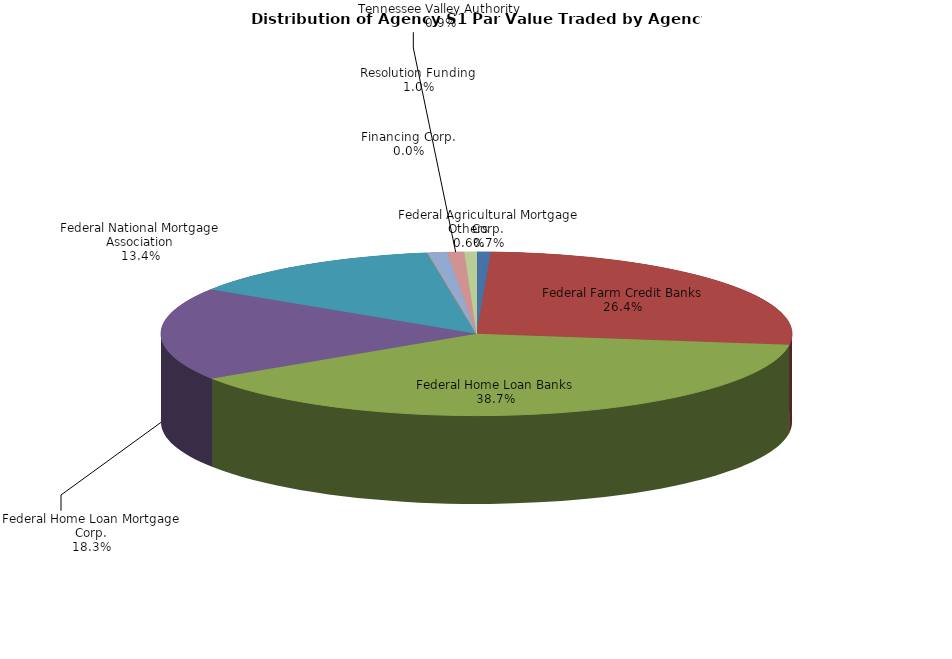
| Category | Series 0 |
|---|---|
| Federal Agricultural Mortgage Corp. | 30058309.524 |
| Federal Farm Credit Banks | 1100131234.246 |
| Federal Home Loan Banks | 1609595474.168 |
| Federal Home Loan Mortgage Corp. | 762347745.919 |
| Federal National Mortgage Association | 557626809.005 |
| Financing Corp. | 229281.746 |
| Resolution Funding | 41376634.921 |
| Tennessee Valley Authority | 35959971.661 |
| Others | 25757554.719 |